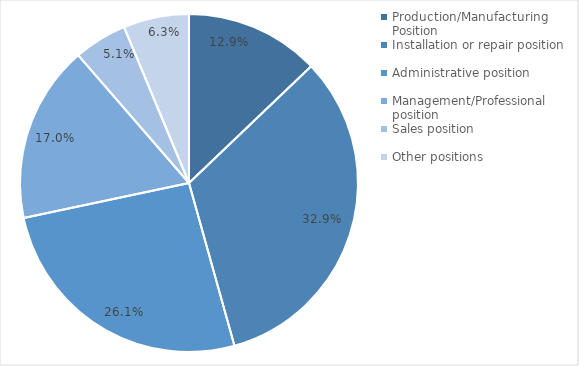
| Category | Occupational Distribution |
|---|---|
| Production/Manufacturing Position | 0.129 |
| Installation or repair position | 0.329 |
| Administrative position | 0.261 |
| Management/Professional position | 0.17 |
| Sales position | 0.051 |
| Other positions  | 0.063 |